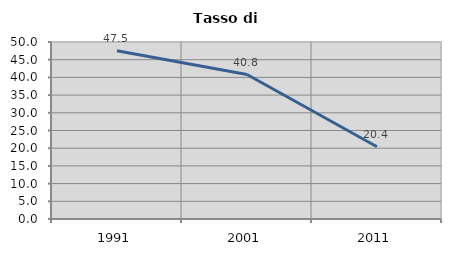
| Category | Tasso di disoccupazione   |
|---|---|
| 1991.0 | 47.524 |
| 2001.0 | 40.815 |
| 2011.0 | 20.419 |